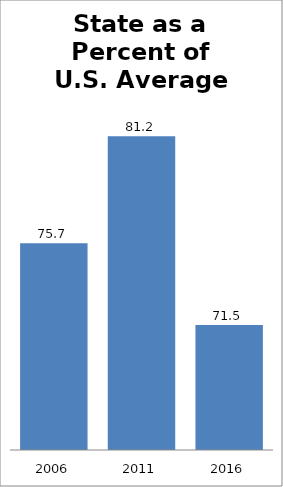
| Category | Series 0 |
|---|---|
| 2006.0 | 75.7 |
| 2011.0 | 81.228 |
| 2016.0 | 71.471 |